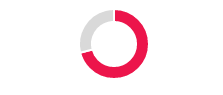
| Category | series1 |
|---|---|
| 0 | 0.71 |
| 1 | 0.29 |